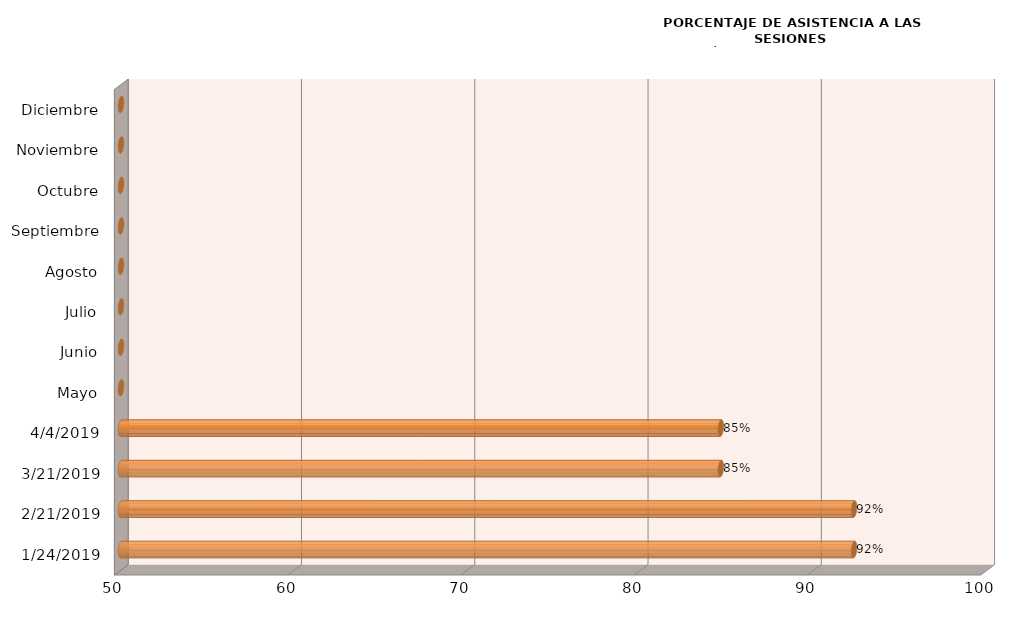
| Category | Series 0 |
|---|---|
| 24/01/2019 | 92.308 |
| 21/02/2019 | 92.308 |
| 21/03/2019 | 84.615 |
| 04/04/2019 | 84.615 |
| Mayo | 0 |
| Junio | 0 |
| Julio | 0 |
| Agosto | 0 |
| Septiembre | 0 |
| Octubre | 0 |
| Noviembre | 0 |
| Diciembre | 0 |